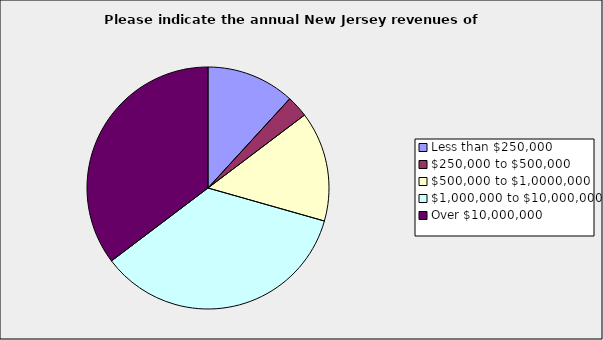
| Category | Series 0 |
|---|---|
| Less than $250,000 | 0.118 |
| $250,000 to $500,000 | 0.029 |
| $500,000 to $1,0000,000 | 0.147 |
| $1,000,000 to $10,000,000 | 0.353 |
| Over $10,000,000 | 0.353 |